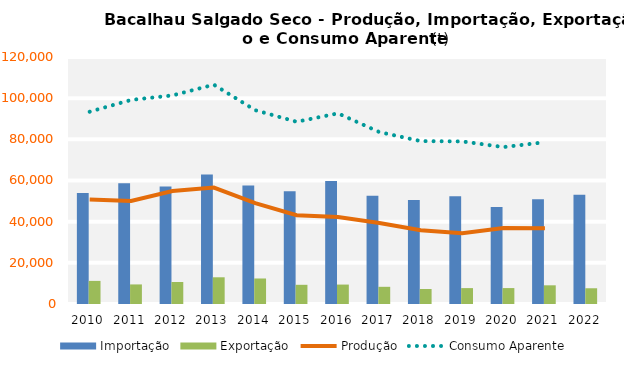
| Category | Importação | Exportação |
|---|---|---|
| 0 | 53921.22 | 11222 |
| 1 | 58609.221 | 9507.991 |
| 2 | 57106.824 | 10681.386 |
| 3 | 62966.619 | 12976.824 |
| 4 | 57584.769 | 12394.497 |
| 5 | 54725.238 | 9326.498 |
| 6 | 59792.726 | 9439.445 |
| 7 | 52566.817 | 8350.311 |
| 8 | 50558.228 | 7295.023 |
| 9 | 52342.477 | 7722.553 |
| 10 | 47066.525 | 7736.072 |
| 11 | 50845.527 | 9079.711 |
| 12 | 53047.137 | 7645.501 |